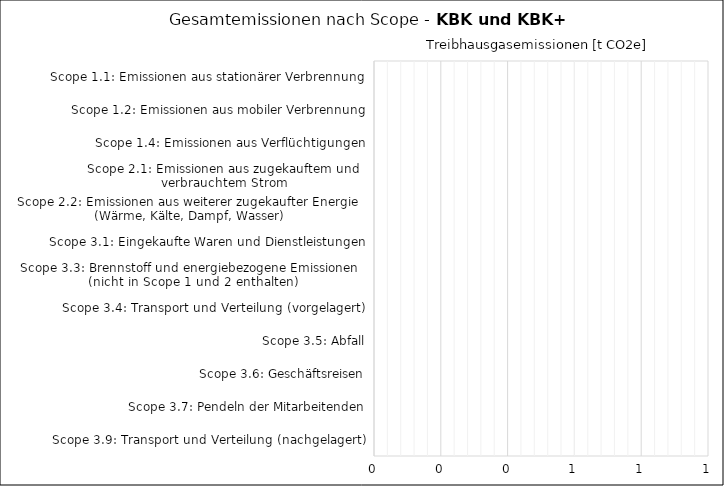
| Category | Series 0 |
|---|---|
| Scope 1.1: Emissionen aus stationärer Verbrennung | 0 |
| Scope 1.2: Emissionen aus mobiler Verbrennung | 0 |
| Scope 1.4: Emissionen aus Verflüchtigungen | 0 |
| Scope 2.1: Emissionen aus zugekauftem und 
verbrauchtem Strom | 0 |
| Scope 2.2: Emissionen aus weiterer zugekaufter Energie 
(Wärme, Kälte, Dampf, Wasser) | 0 |
| Scope 3.1: Eingekaufte Waren und Dienstleistungen | 0 |
| Scope 3.3: Brennstoff und energiebezogene Emissionen 
(nicht in Scope 1 und 2 enthalten) | 0 |
| Scope 3.4: Transport und Verteilung (vorgelagert) | 0 |
| Scope 3.5: Abfall | 0 |
| Scope 3.6: Geschäftsreisen | 0 |
| Scope 3.7: Pendeln der Mitarbeitenden | 0 |
| Scope 3.9: Transport und Verteilung (nachgelagert) | 0 |